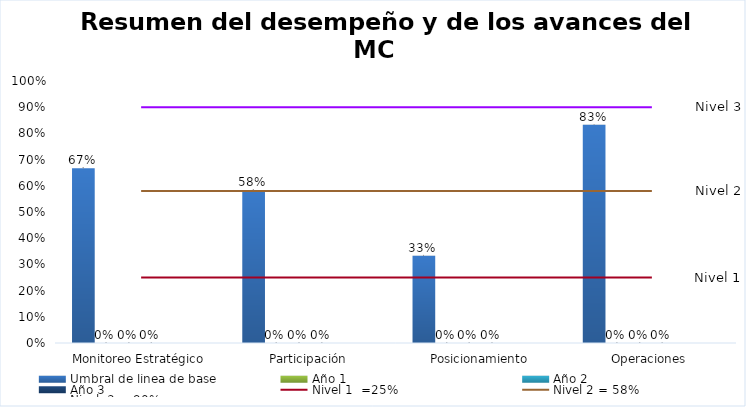
| Category | Umbral de línea de base | Año 1 | Año 2 | Año 3 | empty column | Series 8 |
|---|---|---|---|---|---|---|
| Monitoreo Estratégico | 0.667 | 0 | 0 | 0 |  |  |
| Participación | 0.583 | 0 | 0 | 0 |  |  |
| Posicionamiento | 0.333 | 0 | 0 | 0 |  |  |
| Operaciones | 0.833 | 0 | 0 | 0 |  |  |